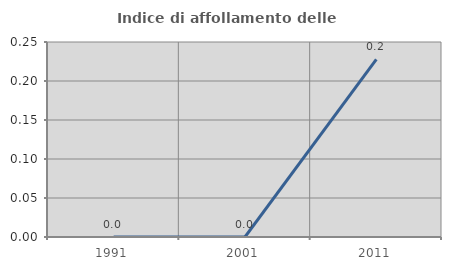
| Category | Indice di affollamento delle abitazioni  |
|---|---|
| 1991.0 | 0 |
| 2001.0 | 0 |
| 2011.0 | 0.228 |